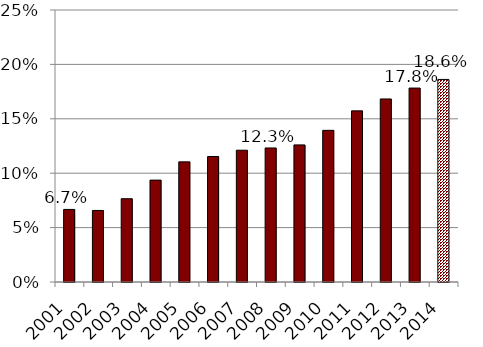
| Category | ARC/Payroll |
|---|---|
| 2001.0 | 0.067 |
| 2002.0 | 0.066 |
| 2003.0 | 0.077 |
| 2004.0 | 0.094 |
| 2005.0 | 0.11 |
| 2006.0 | 0.115 |
| 2007.0 | 0.121 |
| 2008.0 | 0.123 |
| 2009.0 | 0.126 |
| 2010.0 | 0.139 |
| 2011.0 | 0.157 |
| 2012.0 | 0.168 |
| 2013.0 | 0.178 |
| 2014.0 | 0.186 |